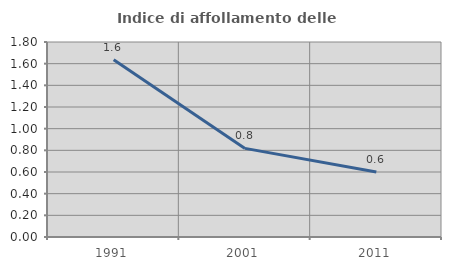
| Category | Indice di affollamento delle abitazioni  |
|---|---|
| 1991.0 | 1.636 |
| 2001.0 | 0.818 |
| 2011.0 | 0.6 |